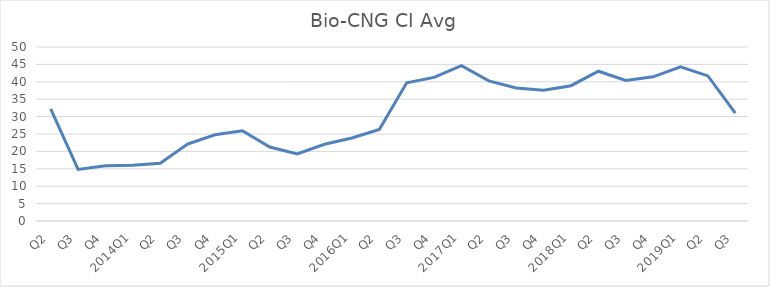
| Category | Bio-CNG CI Avg |
|---|---|
| Q2 | 32.21 |
| Q3 | 14.83 |
| Q4 | 15.88 |
| 2014Q1 | 16.02 |
| Q2 | 16.62 |
| Q3 | 22.11 |
| Q4 | 24.76 |
| 2015Q1 | 25.91 |
| Q2 | 21.26 |
| Q3 | 19.3 |
| Q4 | 22.06 |
| 2016Q1 | 23.84 |
| Q2 | 26.3 |
| Q3 | 39.71 |
| Q4 | 41.27 |
| 2017Q1 | 44.65 |
| Q2 | 40.27 |
| Q3 | 38.22 |
| Q4 | 37.55 |
| 2018Q1 | 38.88 |
| Q2 | 43.04 |
| Q3 | 40.39 |
| Q4 | 41.44 |
| 2019Q1 | 44.28 |
| Q2 | 41.69 |
| Q3 | 31 |